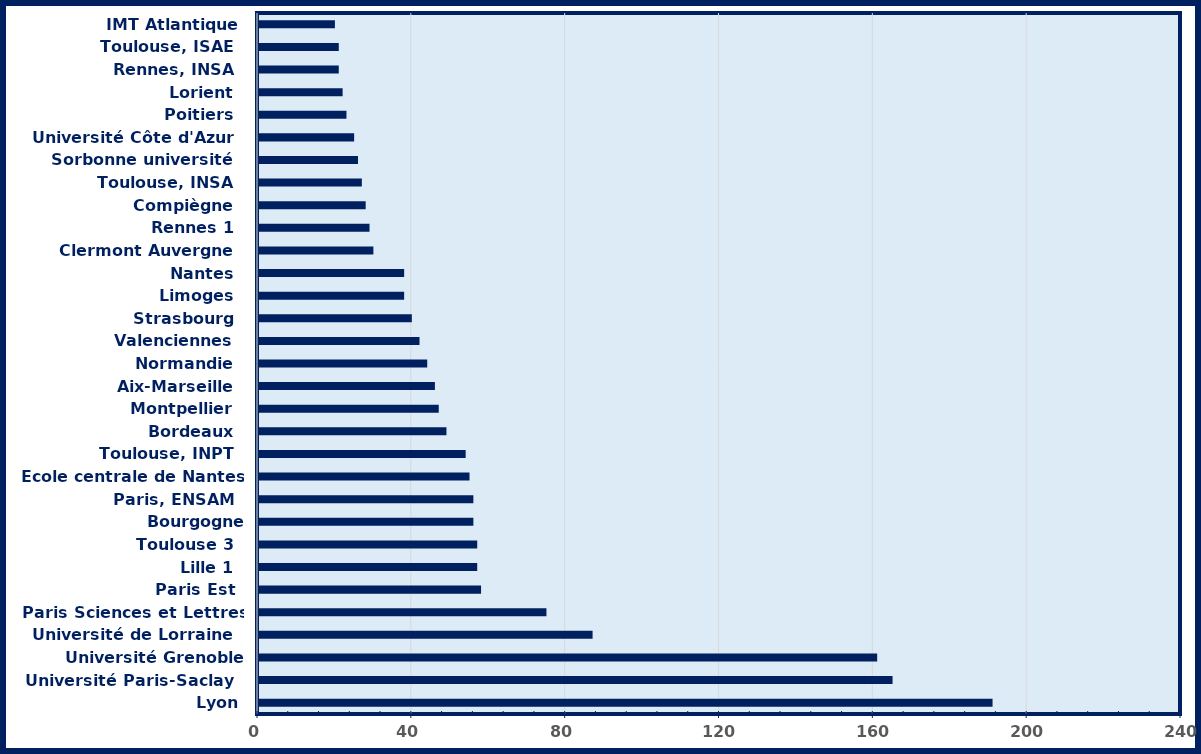
| Category | Series 0 |
|---|---|
| Lyon | 191 |
|  Université Paris-Saclay  | 165 |
|  Université Grenoble Alpes  | 161 |
|  Université de Lorraine  | 87 |
|  Paris Sciences et Lettres  | 75 |
|  Paris Est  | 58 |
|  Lille 1  | 57 |
|  Toulouse 3  | 57 |
|  Bourgogne Franche-Comté  | 56 |
|  Paris, ENSAM  | 56 |
|  Ecole centrale de Nantes  | 55 |
|  Toulouse, INPT  | 54 |
|  Bordeaux  | 49 |
|  Montpellier  | 47 |
|  Aix-Marseille  | 46 |
|  Normandie  | 44 |
|  Valenciennes  | 42 |
|  Strasbourg  | 40 |
|  Limoges  | 38 |
|  Nantes  | 38 |
|  Clermont Auvergne  | 30 |
|  Rennes 1  | 29 |
|  Compiègne  | 28 |
|  Toulouse, INSA  | 27 |
|  Sorbonne université  | 26 |
|  Université Côte d'Azur  | 25 |
|  Poitiers  | 23 |
|  Lorient  | 22 |
|  Rennes, INSA  | 21 |
|  Toulouse, ISAE  | 21 |
| IMT Atlantique | 20 |